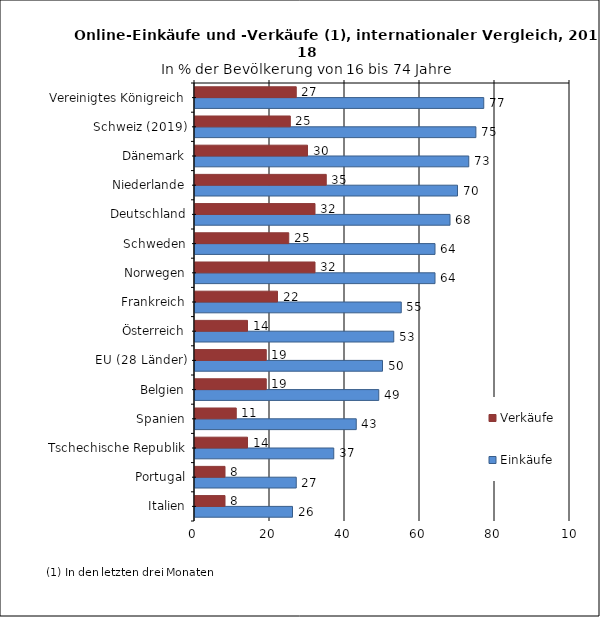
| Category | Einkäufe | Verkäufe |
|---|---|---|
| Italien | 26 | 8 |
| Portugal | 27 | 8 |
| Tschechische Republik | 37 | 14 |
| Spanien | 43 | 11 |
| Belgien | 49 | 19 |
| EU (28 Länder) | 50 | 19 |
| Österreich | 53 | 14 |
| Frankreich | 55 | 22 |
| Norwegen | 64 | 32 |
| Schweden | 64 | 25 |
| Deutschland | 68 | 32 |
| Niederlande | 70 | 35 |
| Dänemark | 73 | 30 |
| Schweiz (2019) | 74.905 | 25.417 |
| Vereinigtes Königreich | 77 | 27 |